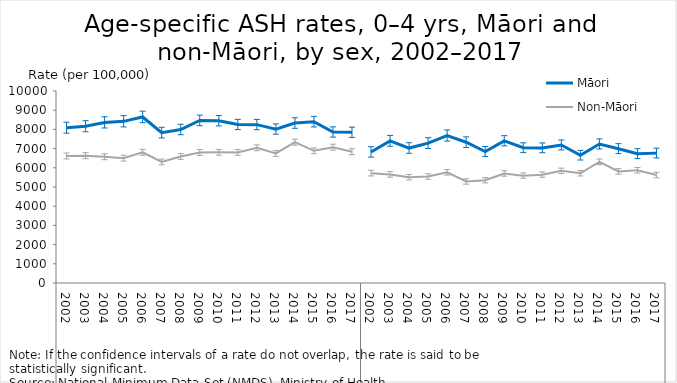
| Category | Māori | Non-Māori |
|---|---|---|
| 0 | 8084.551 | 6615.836 |
| 1 | 8161.977 | 6630.563 |
| 2 | 8362.296 | 6574.909 |
| 3 | 8419.372 | 6501.623 |
| 4 | 8646.195 | 6805.262 |
| 5 | 7830.046 | 6305.134 |
| 6 | 7991.371 | 6587.347 |
| 7 | 8465.105 | 6796.861 |
| 8 | 8449.56 | 6804 |
| 9 | 8252.514 | 6798.342 |
| 10 | 8247.96 | 7041.167 |
| 11 | 8013.429 | 6746.215 |
| 12 | 8328.275 | 7334.725 |
| 13 | 8399.906 | 6885.332 |
| 14 | 7862.004 | 7071.882 |
| 15 | 7847.303 | 6836.968 |
| 16 | 6823.595 | 5721.634 |
| 17 | 7399.777 | 5656 |
| 18 | 7027.253 | 5510.194 |
| 19 | 7284.471 | 5545.235 |
| 20 | 7676.314 | 5764.469 |
| 21 | 7331.558 | 5285.938 |
| 22 | 6846.915 | 5350.224 |
| 23 | 7403.941 | 5705.753 |
| 24 | 7043.603 | 5592.413 |
| 25 | 7037.655 | 5643.899 |
| 26 | 7186.293 | 5840.503 |
| 27 | 6653.601 | 5714.028 |
| 28 | 7239.008 | 6310.029 |
| 29 | 6994.549 | 5811.895 |
| 30 | 6736.816 | 5868.74 |
| 31 | 6764.344 | 5621.332 |